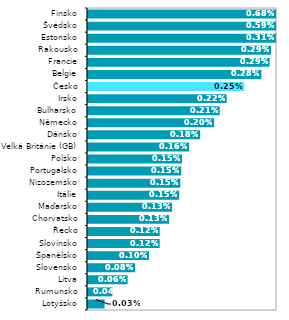
| Category | Series 0 |
|---|---|
| Lotyšsko | 0 |
| Rumunsko | 0 |
| Litva | 0.001 |
| Slovensko | 0.001 |
| Španělsko | 0.001 |
| Slovinsko | 0.001 |
| Řecko | 0.001 |
| Chorvatsko | 0.001 |
| Maďarsko | 0.001 |
| Itálie | 0.001 |
| Nizozemsko | 0.001 |
| Portugalsko | 0.001 |
| Polsko | 0.002 |
| Velká Británie (GB) | 0.002 |
| Dánsko | 0.002 |
| Německo | 0.002 |
| Bulharsko | 0.002 |
| Irsko | 0.002 |
| Česko | 0.002 |
| Belgie | 0.003 |
| Francie | 0.003 |
| Rakousko | 0.003 |
| Estonsko | 0.003 |
| Švédsko | 0.006 |
| Finsko | 0.007 |